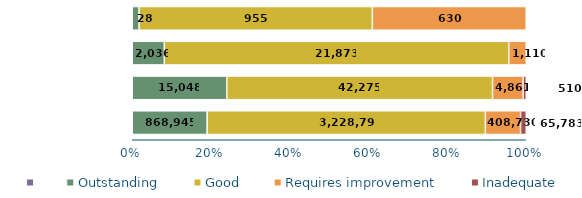
| Category | Series 1 | Outstanding | Good | Requires improvement | Inadequate |
|---|---|---|---|---|---|
| Existing places | 0 | 868945 | 3228797 | 408730 | 65783 |
| New places | 0 | 15048 | 42275 | 4861 | 510 |
| Existing places | 0 | 2036 | 21873 | 1110 | 0 |
| New places | 0 | 28 | 955 | 630 | 0 |